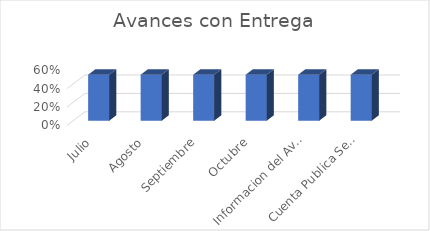
| Category | Series 0 |
|---|---|
| Julio | 0.5 |
| Agosto | 0.5 |
| Septiembre | 0.5 |
| Octubre | 0.5 |
| Informacion del Avance en Gestion Financiera Sementral 2020 | 0.5 |
| Cuenta Publica Semestral | 0.5 |